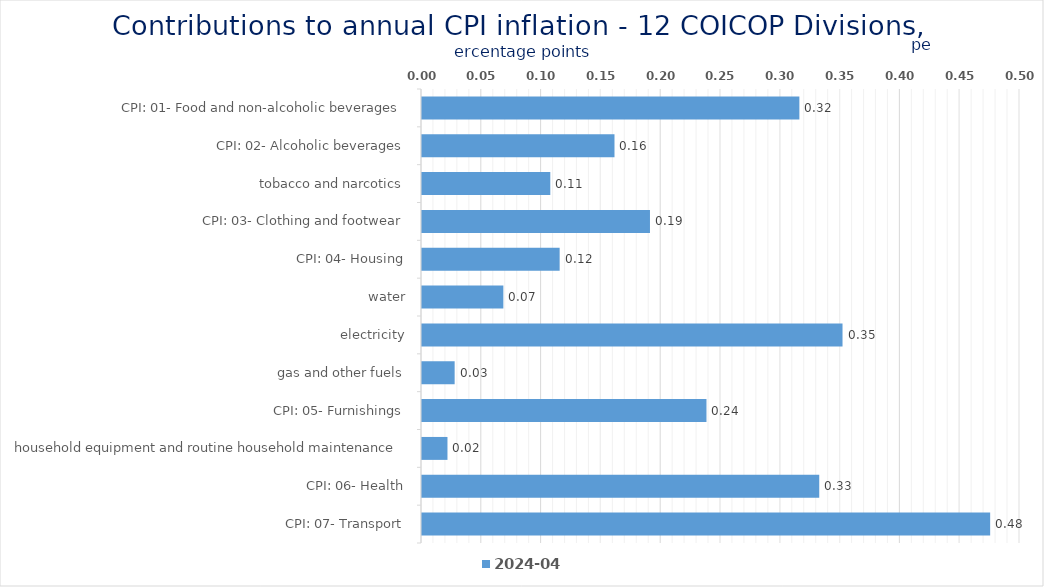
| Category | 2024-04 |
|---|---|
| CPI: 01- Food and non-alcoholic beverages | 0.316 |
| CPI: 02- Alcoholic beverages, tobacco and narcotics | 0.161 |
| CPI: 03- Clothing and footwear | 0.107 |
| CPI: 04- Housing, water, electricity, gas and other fuels | 0.191 |
| CPI: 05- Furnishings, household equipment and routine household maintenance | 0.115 |
| CPI: 06- Health | 0.068 |
| CPI: 07- Transport | 0.352 |
| CPI: 08- Communication | 0.027 |
| CPI: 09- Recreation and culture | 0.238 |
| CPI: 10- Education | 0.021 |
| CPI: 11- Restaurants and hotels | 0.332 |
| CPI: 12- Miscellaneous goods and services | 0.475 |